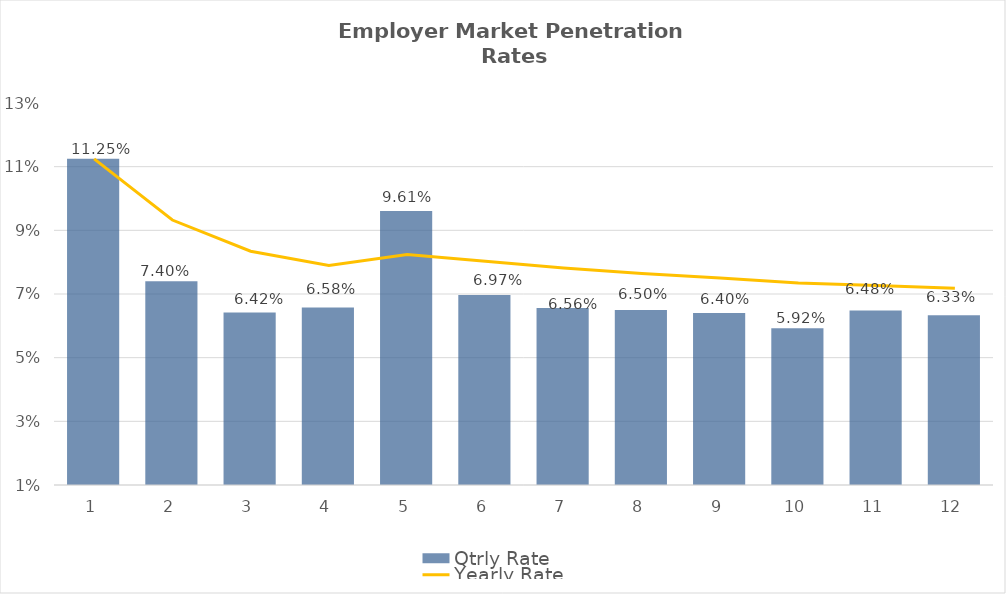
| Category | Qtrly Rate |
|---|---|
| 0 | 0.112 |
| 1 | 0.074 |
| 2 | 0.064 |
| 3 | 0.066 |
| 4 | 0.096 |
| 5 | 0.07 |
| 6 | 0.066 |
| 7 | 0.065 |
| 8 | 0.064 |
| 9 | 0.059 |
| 10 | 0.065 |
| 11 | 0.063 |